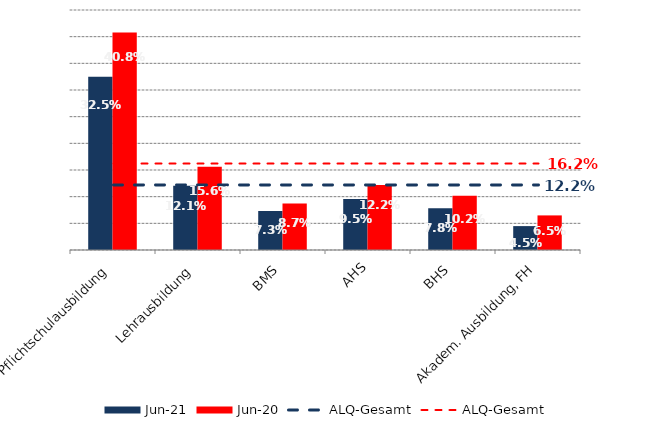
| Category | Jun 21 | Jun 20 |
|---|---|---|
| Pflichtschulausbildung | 0.325 | 0.408 |
| Lehrausbildung | 0.121 | 0.156 |
| BMS | 0.073 | 0.087 |
| AHS | 0.095 | 0.122 |
| BHS | 0.078 | 0.102 |
| Akadem. Ausbildung, FH | 0.045 | 0.065 |